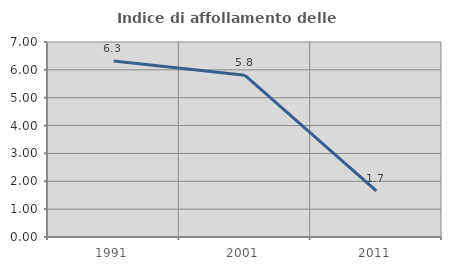
| Category | Indice di affollamento delle abitazioni  |
|---|---|
| 1991.0 | 6.321 |
| 2001.0 | 5.804 |
| 2011.0 | 1.652 |